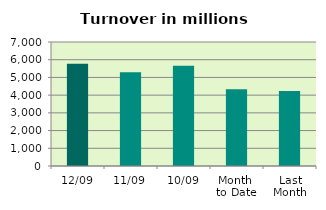
| Category | Series 0 |
|---|---|
| 12/09 | 5775.24 |
| 11/09 | 5295.83 |
| 10/09 | 5653.921 |
| Month 
to Date | 4330.936 |
| Last
Month | 4240.294 |